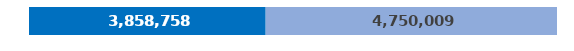
| Category | Current Supply | Finance Gap |
|---|---|---|
| 0 | 3858757.518 | 4750008.889 |